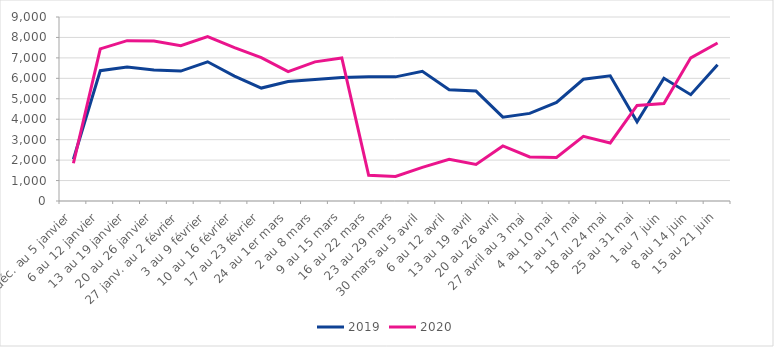
| Category | 2019 | 2020 |
|---|---|---|
| 30 déc. au 5 janvier | 2040 | 1845 |
| 6 au 12 janvier | 6373 | 7438 |
| 13 au 19 janvier | 6555 | 7843 |
| 20 au 26 janvier | 6409 | 7828 |
| 27 janv. au 2 février | 6354 | 7598 |
| 3 au 9 février | 6810 | 8041 |
| 10 au 16 février | 6110 | 7505 |
| 17 au 23 février | 5524 | 7013 |
| 24 au 1er mars | 5849 | 6330 |
| 2 au 8 mars | 5946 | 6806 |
| 9 au 15 mars | 6046 | 6994 |
| 16 au 22 mars | 6072 | 1261 |
| 23 au 29 mars | 6072 | 1202 |
| 30 mars au 5 avril | 6344 | 1645 |
| 6 au 12 avril | 5441 | 2045 |
| 13 au 19 avril | 5376 | 1789 |
| 20 au 26 avril | 4101 | 2692 |
| 27 avril au 3 mai | 4285 | 2152 |
| 4 au 10 mai | 4818 | 2128 |
| 11 au 17 mai | 5955 | 3161 |
| 18 au 24 mai | 6121 | 2839 |
| 25 au 31 mai | 3878 | 4674 |
| 1 au 7 juin | 6002 | 4772 |
| 8 au 14 juin | 5200 | 7002 |
| 15 au 21 juin | 6666 | 7729 |